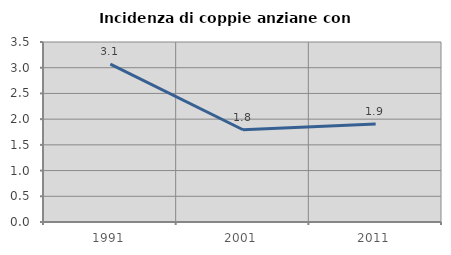
| Category | Incidenza di coppie anziane con figli |
|---|---|
| 1991.0 | 3.07 |
| 2001.0 | 1.794 |
| 2011.0 | 1.905 |